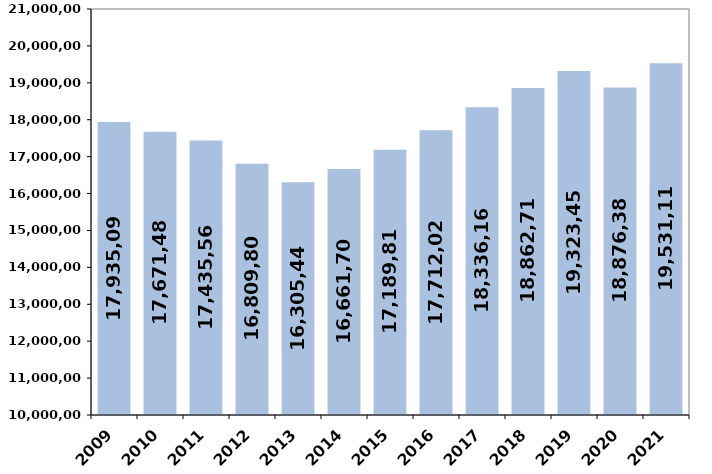
| Category | % de variación
 interanual |
|---|---|
| 2009 | 17935094.55 |
| 2010 | 17671479.63 |
| 2011 | 17435561.63 |
| 2012 | 16809803.15 |
| 2013 | 16305445.38 |
| 2014 | 16661702.95 |
| 2015 | 17189815 |
| 2016 | 17712020.69 |
| 2017 | 18336161.45 |
| 2018 | 18862712.8 |
| 2019 | 19323451 |
| 2020 | 18876389 |
| 2021 | 19531111.364 |